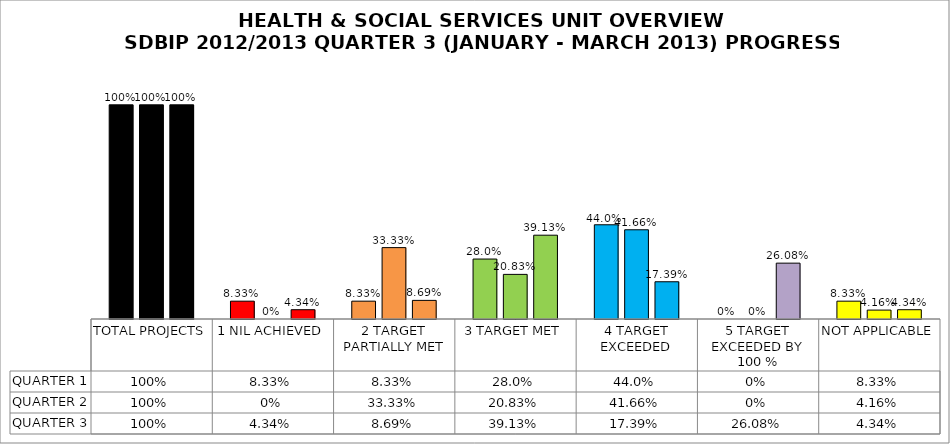
| Category | QUARTER 1 | QUARTER 2 | QUARTER 3 |
|---|---|---|---|
| TOTAL PROJECTS | 1 | 1 | 1 |
| 1 NIL ACHIEVED | 0.083 | 0 | 0.043 |
| 2 TARGET PARTIALLY MET | 0.083 | 0.333 | 0.087 |
| 3 TARGET MET | 0.28 | 0.208 | 0.391 |
| 4 TARGET EXCEEDED | 0.44 | 0.417 | 0.174 |
| 5 TARGET EXCEEDED BY 100 % | 0 | 0 | 0.261 |
| NOT APPLICABLE | 0.083 | 0.042 | 0.043 |